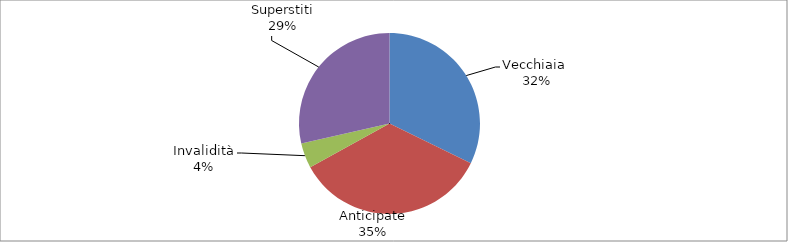
| Category | Series 0 |
|---|---|
| Vecchiaia  | 6059 |
| Anticipate | 6533 |
| Invalidità | 835 |
| Superstiti | 5369 |